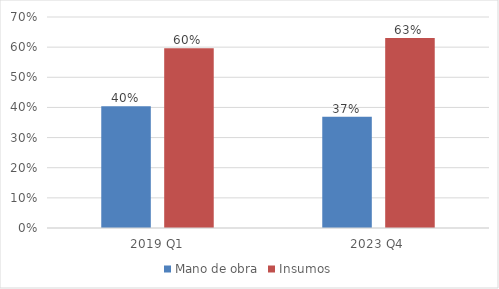
| Category | Mano de obra | Insumos |
|---|---|---|
| 2019 Q1 | 0.404 | 0.596 |
| 2023 Q4 | 0.369 | 0.631 |